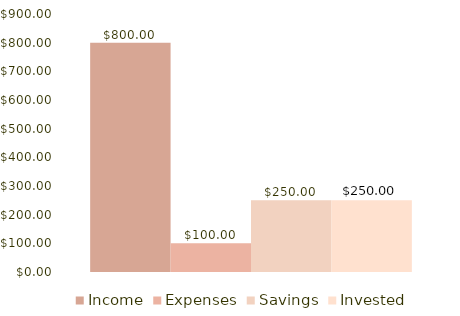
| Category | Income | Expenses | Savings | Invested |
|---|---|---|---|---|
| 0 | 800 | 100 | 250 | 250 |